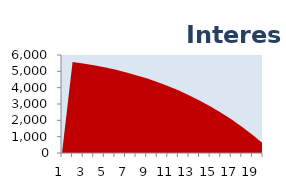
| Category | Interest |
|---|---|
| 0 | 0 |
| 1 | 5578.115 |
| 2 | 5482.479 |
| 3 | 5372.498 |
| 4 | 5247.14 |
| 5 | 5105.306 |
| 6 | 4945.829 |
| 7 | 4767.467 |
| 8 | 4568.902 |
| 9 | 4348.73 |
| 10 | 4105.462 |
| 11 | 3837.514 |
| 12 | 3543.204 |
| 13 | 3220.743 |
| 14 | 2868.234 |
| 15 | 2483.66 |
| 16 | 2064.877 |
| 17 | 1609.612 |
| 18 | 1115.447 |
| 19 | 579.818 |